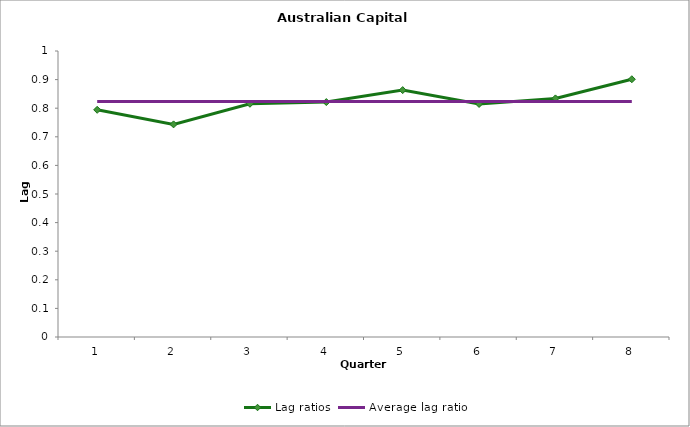
| Category | Lag ratios | Average lag ratio |
|---|---|---|
| 0 | 0.794 | 0.824 |
| 1 | 0.743 | 0.824 |
| 2 | 0.815 | 0.824 |
| 3 | 0.821 | 0.824 |
| 4 | 0.863 | 0.824 |
| 5 | 0.815 | 0.824 |
| 6 | 0.834 | 0.824 |
| 7 | 0.901 | 0.824 |